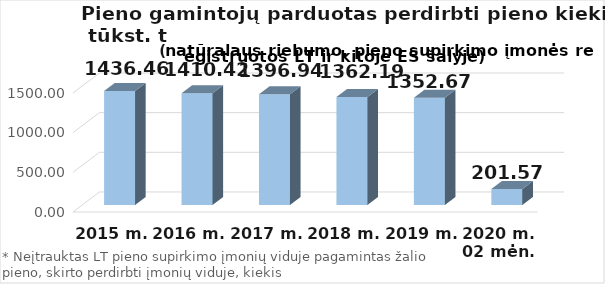
| Category | Viso |
|---|---|
| 2015 m. | 1436.455 |
| 2016 m. | 1410.42 |
| 2017 m.  | 1396.944 |
| 2018 m.  | 1362.189 |
| 2019 m.  | 1352.67 |
| 2020 m. 02 mėn. | 201.57 |